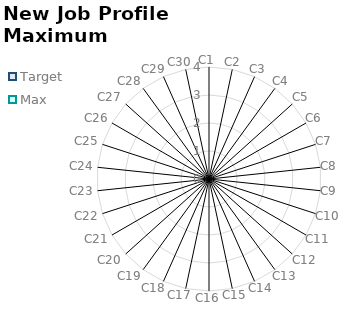
| Category | Target | Max |
|---|---|---|
| C1 | 0 | 0 |
| C2 | 0 | 0 |
| C3 | 0 | 0 |
| C4 | 0 | 0 |
| C5 | 0 | 0 |
| C6 | 0 | 0 |
| C7 | 0 | 0 |
| C8 | 0 | 0 |
| C9 | 0 | 0 |
| C10 | 0 | 0 |
| C11 | 0 | 0 |
| C12 | 0 | 0 |
| C13 | 0 | 0 |
| C14 | 0 | 0 |
| C15 | 0 | 0 |
| C16 | 0 | 0 |
| C17 | 0 | 0 |
| C18 | 0 | 0 |
| C19 | 0 | 0 |
| C20 | 0 | 0 |
| C21 | 0 | 0 |
| C22 | 0 | 0 |
| C23 | 0 | 0 |
| C24 | 0 | 0 |
| C25 | 0 | 0 |
| C26 | 0 | 0 |
| C27 | 0 | 0 |
| C28 | 0 | 0 |
| C29 | 0 | 0 |
| C30 | 0 | 0 |